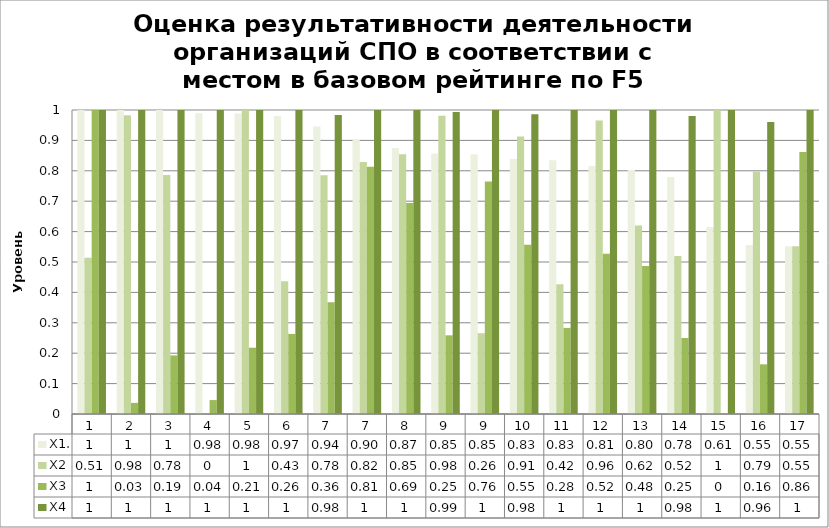
| Category | X1. | X2 | X3 | X4 |
|---|---|---|---|---|
| 1.0 | 1 | 0.514 | 1 | 1 |
| 2.0 | 1 | 0.982 | 0.037 | 1 |
| 3.0 | 1 | 0.786 | 0.193 | 1 |
| 4.0 | 0.989 | 0 | 0.046 | 1 |
| 5.0 | 0.988 | 1 | 0.218 | 1 |
| 6.0 | 0.98 | 0.437 | 0.263 | 1 |
| 7.0 | 0.945 | 0.786 | 0.368 | 0.983 |
| 7.0 | 0.902 | 0.829 | 0.813 | 1 |
| 8.0 | 0.875 | 0.854 | 0.694 | 1 |
| 9.0 | 0.857 | 0.981 | 0.259 | 0.994 |
| 9.0 | 0.854 | 0.266 | 0.765 | 1 |
| 10.0 | 0.839 | 0.912 | 0.557 | 0.986 |
| 11.0 | 0.835 | 0.427 | 0.283 | 1 |
| 12.0 | 0.816 | 0.966 | 0.527 | 1 |
| 13.0 | 0.803 | 0.62 | 0.487 | 1 |
| 14.0 | 0.78 | 0.52 | 0.25 | 0.98 |
| 15.0 | 0.615 | 1 | 0 | 1 |
| 16.0 | 0.556 | 0.797 | 0.163 | 0.961 |
| 17.0 | 0.552 | 0.552 | 0.862 | 1 |